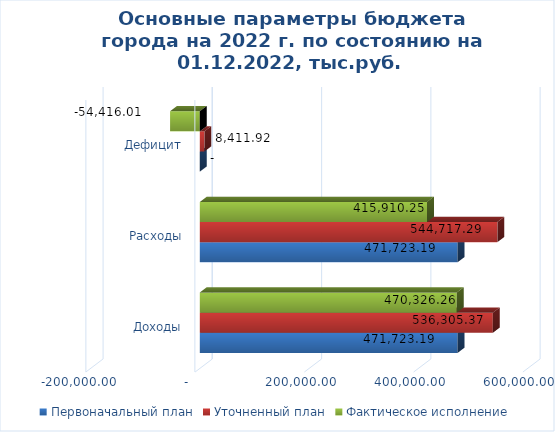
| Category | Первоначальный план | Уточненный план | Фактическое исполнение |
|---|---|---|---|
| Доходы | 471723.19 | 536305.37 | 470326.26 |
| Расходы | 471723.19 | 544717.29 | 415910.25 |
| Дефицит | 0 | 8411.92 | -54416.01 |